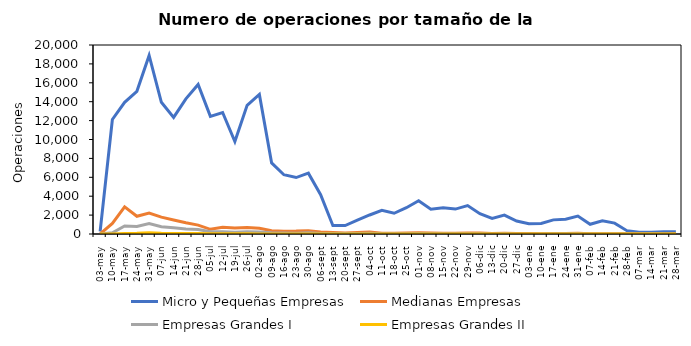
| Category | Micro y Pequeñas Empresas | Medianas Empresas | Empresas Grandes I | Empresas Grandes II |
|---|---|---|---|---|
| 03-may | 263 | 5 | 3 | 0 |
| 10-may | 12118 | 1112 | 131 | 13 |
| 17-may | 13941 | 2865 | 843 | 54 |
| 24-may | 15095 | 1872 | 792 | 69 |
| 31-may | 18900 | 2223 | 1096 | 122 |
| 07-jun | 13940 | 1789 | 776 | 72 |
| 14-jun | 12342 | 1485 | 659 | 62 |
| 21-jun | 14303 | 1183 | 540 | 66 |
| 28-jun | 15820 | 942 | 477 | 53 |
| 05-jul | 12451 | 495 | 249 | 23 |
| 12-jul | 12858 | 709 | 246 | 27 |
| 19-jul | 9782 | 628 | 189 | 20 |
| 26-jul | 13620 | 677 | 230 | 20 |
| 02-ago | 14769 | 611 | 199 | 12 |
| 09-ago | 7518 | 337 | 122 | 7 |
| 16-ago | 6273 | 298 | 116 | 12 |
| 23-ago | 5973 | 308 | 80 | 8 |
| 30-ago | 6437 | 347 | 119 | 12 |
| 06-sept | 4163 | 211 | 65 | 6 |
| 13-sept | 894 | 149 | 49 | 13 |
| 20-sept | 898 | 103 | 42 | 2 |
| 27-sept | 1456 | 153 | 41 | 6 |
| 04-oct | 2012 | 201 | 87 | 13 |
| 11-oct | 2511 | 88 | 28 | 3 |
| 18-oct | 2192 | 84 | 28 | 2 |
| 25-oct | 2780 | 105 | 39 | 4 |
| 01-nov | 3524 | 137 | 49 | 6 |
| 08-nov | 2623 | 103 | 22 | 5 |
| 15-nov | 2771 | 82 | 25 | 2 |
| 22-nov | 2637 | 82 | 26 | 1 |
| 29-nov | 3010 | 112 | 39 | 3 |
| 06-dic | 2149 | 98 | 21 | 1 |
| 13-dic | 1658 | 62 | 11 | 2 |
| 20-dic | 1995 | 68 | 16 | 0 |
| 27-dic | 1371 | 44 | 13 | 0 |
| 03-ene | 1080 | 51 | 6 | 2 |
| 10-ene | 1106 | 39 | 11 | 2 |
| 17-ene | 1495 | 48 | 14 | 0 |
| 24-ene | 1569 | 61 | 14 | 0 |
| 31-ene | 1895 | 74 | 15 | 0 |
| 07-feb | 1026 | 32 | 4 | 0 |
| 14-feb | 1387 | 22 | 8 | 0 |
| 21-feb | 1150 | 38 | 9 | 1 |
| 28-feb | 353 | 27 | 7 | 1 |
| 07-mar | 178 | 15 | 9 | 1 |
| 14-mar | 188 | 19 | 14 | 0 |
| 21-mar | 250 | 10 | 5 | 0 |
| 28-mar | 241 | 15 | 6 | 0 |